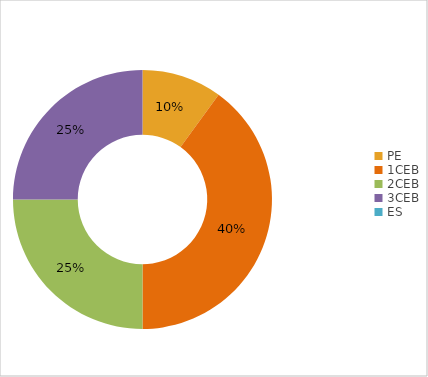
| Category | Series 0 |
|---|---|
| PE | 2 |
| 1CEB | 8 |
| 2CEB | 5 |
| 3CEB | 5 |
| ES | 0 |